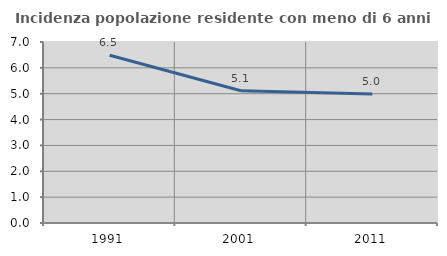
| Category | Incidenza popolazione residente con meno di 6 anni |
|---|---|
| 1991.0 | 6.486 |
| 2001.0 | 5.115 |
| 2011.0 | 4.991 |